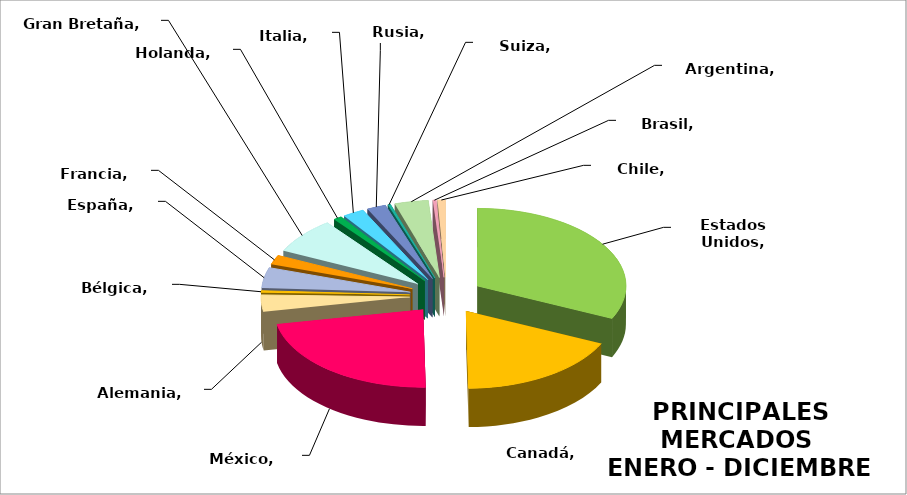
| Category | Series 0 |
|---|---|
| Estados Unidos | 0.307 |
| Canadá | 0.171 |
| México | 0.213 |
| Alemania | 0.033 |
| Bélgica | 0.004 |
| España | 0.041 |
| Francia | 0.019 |
| Gran Bretaña | 0.072 |
| Holanda | 0.009 |
| Italia | 0.022 |
| Rusia | 0.02 |
| Suiza | 0.003 |
| Argentina | 0.035 |
| Brasil | 0.003 |
| Chile | 0.008 |